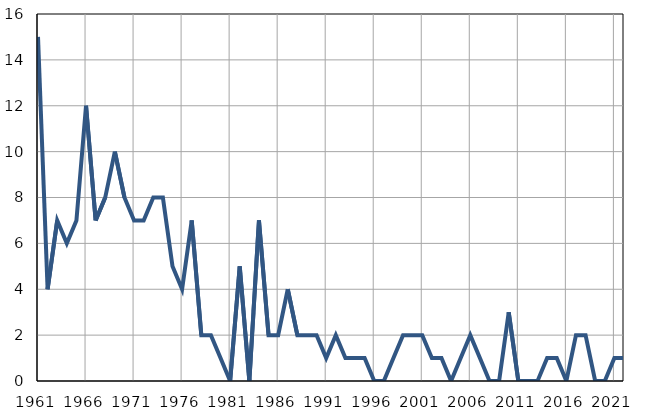
| Category | Infants
deaths |
|---|---|
| 1961.0 | 15 |
| 1962.0 | 4 |
| 1963.0 | 7 |
| 1964.0 | 6 |
| 1965.0 | 7 |
| 1966.0 | 12 |
| 1967.0 | 7 |
| 1968.0 | 8 |
| 1969.0 | 10 |
| 1970.0 | 8 |
| 1971.0 | 7 |
| 1972.0 | 7 |
| 1973.0 | 8 |
| 1974.0 | 8 |
| 1975.0 | 5 |
| 1976.0 | 4 |
| 1977.0 | 7 |
| 1978.0 | 2 |
| 1979.0 | 2 |
| 1980.0 | 1 |
| 1981.0 | 0 |
| 1982.0 | 5 |
| 1983.0 | 0 |
| 1984.0 | 7 |
| 1985.0 | 2 |
| 1986.0 | 2 |
| 1987.0 | 4 |
| 1988.0 | 2 |
| 1989.0 | 2 |
| 1990.0 | 2 |
| 1991.0 | 1 |
| 1992.0 | 2 |
| 1993.0 | 1 |
| 1994.0 | 1 |
| 1995.0 | 1 |
| 1996.0 | 0 |
| 1997.0 | 0 |
| 1998.0 | 1 |
| 1999.0 | 2 |
| 2000.0 | 2 |
| 2001.0 | 2 |
| 2002.0 | 1 |
| 2003.0 | 1 |
| 2004.0 | 0 |
| 2005.0 | 1 |
| 2006.0 | 2 |
| 2007.0 | 1 |
| 2008.0 | 0 |
| 2009.0 | 0 |
| 2010.0 | 3 |
| 2011.0 | 0 |
| 2012.0 | 0 |
| 2013.0 | 0 |
| 2014.0 | 1 |
| 2015.0 | 1 |
| 2016.0 | 0 |
| 2017.0 | 2 |
| 2018.0 | 2 |
| 2019.0 | 0 |
| 2020.0 | 0 |
| 2021.0 | 1 |
| 2022.0 | 1 |